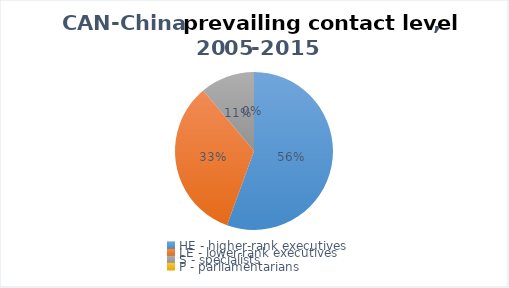
| Category | 2005-2015 |
|---|---|
| HE - higher-rank executives | 5 |
| LE - lower-rank executives | 3 |
| S - specialists | 1 |
| P - parliamentarians | 0 |